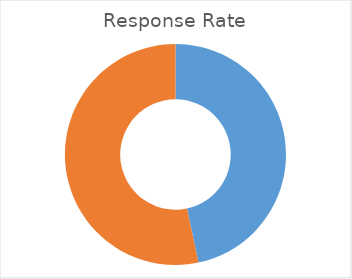
| Category | Total |
|---|---|
| Sum of Overall Response | 46.671 |
| Sum of Non Resp | 53.329 |